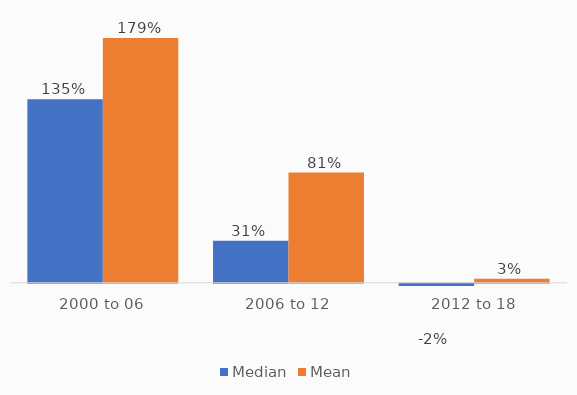
| Category | Median | Mean |
|---|---|---|
| 2000 to 06 | 1.346 | 1.794 |
| 2006 to 12 | 0.308 | 0.808 |
| 2012 to 18 | -0.016 | 0.029 |